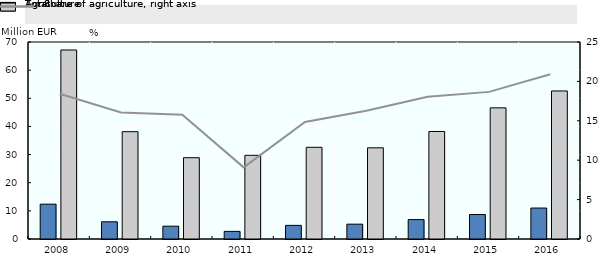
| Category | Agriculture | Total |
|---|---|---|
| 2008.0 | 12.379 | 67.16 |
| 2009.0 | 6.118 | 38.133 |
| 2010.0 | 4.553 | 28.884 |
| 2011.0 | 2.704 | 29.738 |
| 2012.0 | 4.838 | 32.584 |
| 2013.0 | 5.27 | 32.4 |
| 2014.0 | 6.9 | 38.2 |
| 2015.0 | 8.7 | 46.6 |
| 2016.0 | 11 | 52.6 |